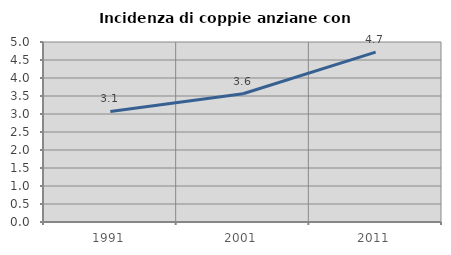
| Category | Incidenza di coppie anziane con figli |
|---|---|
| 1991.0 | 3.07 |
| 2001.0 | 3.562 |
| 2011.0 | 4.719 |